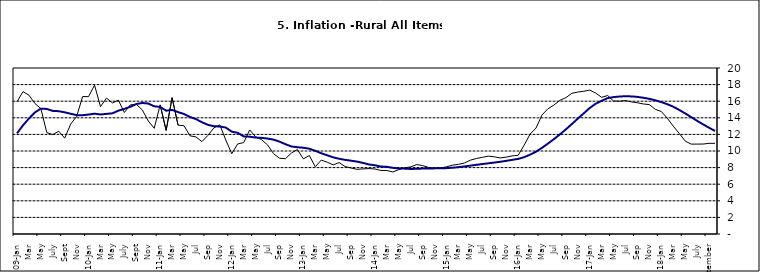
| Category | Series 0 | Series 1 |
|---|---|---|
| 09-Jan | 15.918 | 12.128 |
| Feb | 17.154 | 13.086 |
| Mar | 16.729 | 13.912 |
| Apr | 15.727 | 14.644 |
| May | 15.113 | 15.104 |
| June | 12.213 | 15.067 |
| July | 11.974 | 14.832 |
| Aug | 12.38 | 14.796 |
| Sept | 11.548 | 14.661 |
| Oct | 13.242 | 14.488 |
| Nov | 14.164 | 14.321 |
|  | 16.557 | 14.316 |
| 10-Jan | 16.548 | 14.39 |
| Feb | 17.934 | 14.494 |
| Mar | 15.346 | 14.401 |
| Apr | 16.373 | 14.473 |
| May | 15.794 | 14.54 |
| June | 16.126 | 14.862 |
| July | 14.634 | 15.072 |
| Aug | 15.556 | 15.33 |
| Sept | 15.616 | 15.658 |
| Oct | 14.955 | 15.786 |
| Nov | 13.616 | 15.719 |
| Dec | 12.735 | 15.385 |
| 11-Jan | 15.553 | 15.311 |
| Feb | 12.482 | 14.856 |
| Mar | 16.422 | 14.956 |
| Apr | 13.117 | 14.687 |
| May | 13.041 | 14.457 |
| Jun | 11.83 | 14.095 |
| Jul | 11.699 | 13.84 |
| Aug | 11.13 | 13.464 |
| Sep | 11.878 | 13.156 |
| Oct | 12.778 | 12.985 |
| Nov | 13.147 | 12.95 |
| Dec | 11.326 | 12.824 |
| 12-Jan | 9.678 | 12.33 |
| Feb | 10.856 | 12.188 |
| Mar | 11.014 | 11.76 |
| Apr | 12.536 | 11.724 |
| May | 11.712 | 11.621 |
| Jun | 11.36 | 11.582 |
| Jul | 10.733 | 11.499 |
| Aug | 9.683 | 11.368 |
| Sep | 9.132 | 11.131 |
| Oct | 9.071 | 10.82 |
| Nov | 9.758 | 10.548 |
| Dec | 10.183 | 10.455 |
| 13-Jan | 9.052 | 10.394 |
| Feb | 9.457 | 10.276 |
| Mar | 8.091 | 10.025 |
| Apr | 8.907 | 9.732 |
| May | 8.647 | 9.483 |
| Jun | 8.333 | 9.236 |
| Jul | 8.6 | 9.063 |
| Aug | 8.12 | 8.933 |
| Sep | 7.95 | 8.832 |
| Oct | 7.791 | 8.722 |
| Nov | 7.849 | 8.565 |
| Dec | 7.879 | 8.378 |
| 14-Jan | 7.832 | 8.277 |
| Feb | 7.657 | 8.13 |
| Mar | 7.65 | 8.092 |
| Apr | 7.473 | 7.973 |
| May | 7.761 | 7.901 |
| Jun | 7.98 | 7.874 |
| Jul | 8.086 | 7.834 |
| Aug | 8.368 | 7.858 |
| Sep | 8.244 | 7.883 |
| Oct | 8.019 | 7.903 |
| Nov | 7.898 | 7.906 |
| Dec | 7.955 | 7.913 |
| 15-Jan | 8.094 | 7.935 |
| Feb | 8.291 | 7.988 |
| Mar | 8.396 | 8.05 |
| Apr | 8.556 | 8.14 |
| May | 8.896 | 8.236 |
| Jun | 9.098 | 8.331 |
| Jul | 9.238 | 8.429 |
| Aug | 9.382 | 8.516 |
| Sep | 9.3 | 8.606 |
| Oct | 9.162 | 8.7 |
| Nov | 9.261 | 8.813 |
| Dec | 9.41 | 8.933 |
| 16-Jan | 9.48 | 9.047 |
| Feb | 10.692 | 9.249 |
| Mar | 12.038 | 9.559 |
| Apr | 12.767 | 9.917 |
| May | 14.349 | 10.384 |
| Jun | 15.088 | 10.897 |
| Jul | 15.533 | 11.433 |
| Aug | 16.103 | 12.002 |
| Sep | 16.428 | 12.601 |
| Oct | 16.947 | 13.25 |
| Nov | 17.099 | 13.898 |
| Dec | 17.195 | 14.54 |
| 17-Jan | 17.341 | 15.183 |
| Feb | 16.982 | 15.696 |
| Mar | 16.466 | 16.054 |
| Apr | 16.687 | 16.369 |
| May | 16.023 | 16.497 |
| Jun | 16.007 | 16.563 |
| Jul | 16.078 | 16.6 |
| Aug | 15.914 | 16.577 |
| Sep | 15.812 | 16.52 |
| Oct | 15.666 | 16.411 |
| Nov | 15.587 | 16.285 |
| Dec | 15.018 | 16.104 |
| 18-Jan | 14.756 | 15.892 |
| Feb | 13.957 | 15.638 |
| Mar | 12.987 | 15.339 |
| Apr | 12.126 | 14.95 |
| May | 11.199 | 14.53 |
| June | 10.832 | 14.083 |
| July | 10.831 | 13.636 |
| August | 10.838 | 13.209 |
| September | 10.924 | 12.804 |
| October | 10.927 | 12.418 |